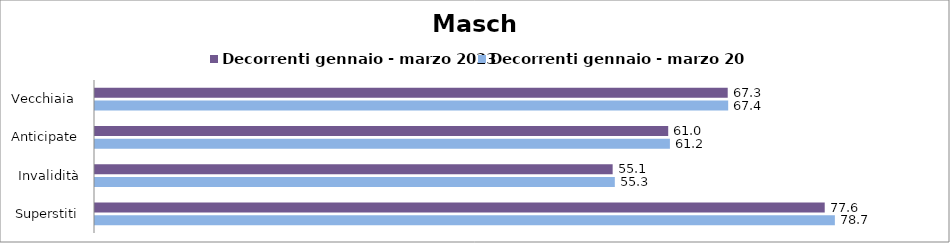
| Category | Decorrenti gennaio - marzo 2023 | Decorrenti gennaio - marzo 2024 |
|---|---|---|
| Vecchiaia  | 67.31 | 67.36 |
| Anticipate | 60.98 | 61.16 |
| Invalidità | 55.07 | 55.3 |
| Superstiti | 77.63 | 78.71 |